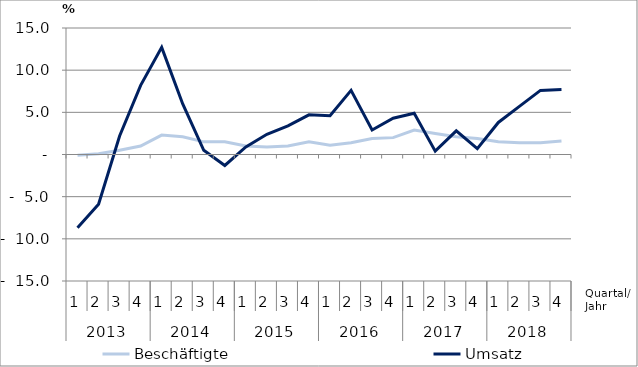
| Category | Beschäftigte | Umsatz |
|---|---|---|
| 0 | -0.1 | -8.7 |
| 1 | 0.1 | -5.9 |
| 2 | 0.5 | 2.2 |
| 3 | 1 | 8.2 |
| 4 | 2.3 | 12.7 |
| 5 | 2.1 | 6 |
| 6 | 1.5 | 0.5 |
| 7 | 1.5 | -1.3 |
| 8 | 1 | 0.9 |
| 9 | 0.9 | 2.4 |
| 10 | 1 | 3.4 |
| 11 | 1.5 | 4.7 |
| 12 | 1.1 | 4.6 |
| 13 | 1.4 | 7.6 |
| 14 | 1.9 | 2.9 |
| 15 | 2 | 4.3 |
| 16 | 2.9 | 4.9 |
| 17 | 2.5 | 0.4 |
| 18 | 2.1 | 2.8 |
| 19 | 1.9 | 0.7 |
| 20 | 1.5 | 3.8 |
| 21 | 1.4 | 5.7 |
| 22 | 1.4 | 7.6 |
| 23 | 1.6 | 7.7 |